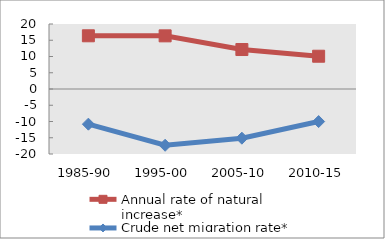
| Category | Annual rate of natural increase* | Crude net migration rate* |
|---|---|---|
| 1985-90 | 16.373 | -10.819 |
| 1995-00 | 16.354 | -17.308 |
| 2005-10 | 12.146 | -15.133 |
| 2010-15 | 10.086 | -10.02 |